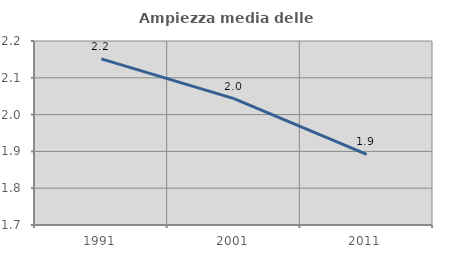
| Category | Ampiezza media delle famiglie |
|---|---|
| 1991.0 | 2.151 |
| 2001.0 | 2.044 |
| 2011.0 | 1.892 |